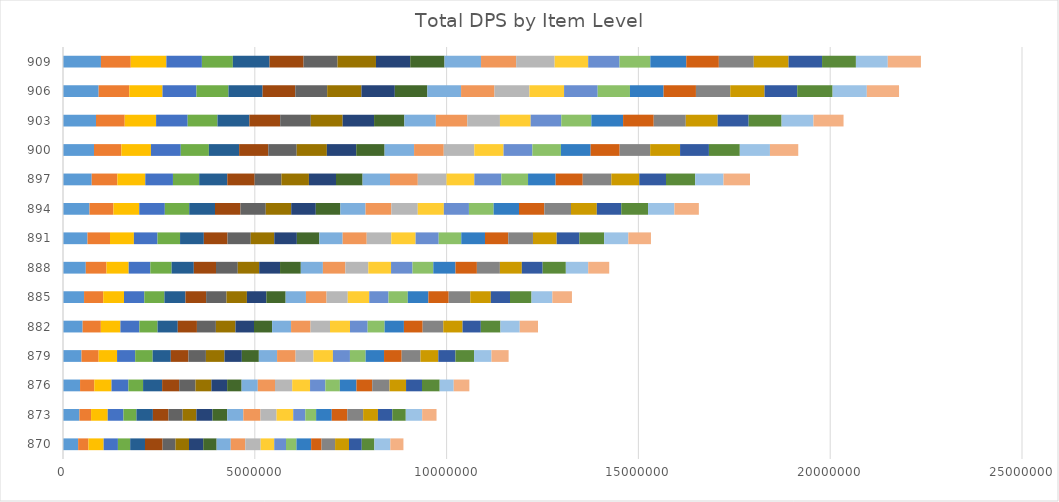
| Category | Series 0 | Series 1 | Series 2 | Series 3 | Series 4 | Series 5 | Series 6 | Series 7 | Series 8 | Series 9 | Series 10 | Series 11 | Series 12 | Series 13 | Series 14 | Series 15 | Series 16 | Series 17 | Series 18 | Series 19 | Series 20 | Series 21 | Series 22 | Series 23 | Series 24 | Series 25 |
|---|---|---|---|---|---|---|---|---|---|---|---|---|---|---|---|---|---|---|---|---|---|---|---|---|---|---|
| 870.0 | 394419.3 | 269606.9 |  | 395287.3 | 372265.7 | 319651 | 386181.6 | 458745.2 | 336645.8 | 351655.5 | 371011.5 | 349453 | 367917.1 | 379374.9 | 401429.1 | 352680 | 307700.9 | 271612.6 | 382913.7 | 271536.3 | 352859.4 | 362802.8 | 332539.2 | 328668.3 | 416358.5 | 341332.624 |
| 873.0 | 429103.8 | 302534.9 |  | 434291.1 | 409994.5 | 338336.5 | 429254.3 | 407485.4 | 368898 | 357621.7 | 420388.4 | 383134.3 | 419614.6 | 447462 | 420334.2 | 433000.1 | 315526.5 | 281643.8 | 407754.8 | 405633.5 | 412478.5 | 385521.7 | 374979.5 | 350962.3 | 427013.6 | 374518.72 |
| 876.0 | 444511.6 | 370818.8 |  | 449016.2 | 441510.3 | 381606.6 | 496777 | 444780.3 | 424818.9 | 415264.6 | 410129.5 | 376692.8 | 422042.5 | 448383.5 | 448683.9 | 465073.3 | 399655.5 | 377892.6 | 432641.5 | 410653.6 | 450718.7 | 431317.9 | 415995.7 | 460807.9 | 365951.1 | 407429.772 |
| 879.0 | 482195.6 | 447368.1 |  | 479811.2 | 472477.7 | 455389.8 | 473089.6 | 460170.7 | 455087.8 | 483439.3 | 453022.3 | 443524.2 | 475129.9 | 483216.8 | 465142.7 | 507461.1 | 443789.2 | 408812.8 | 479725.5 | 460278.4 | 489716.6 | 465396.6 | 446590.4 | 485114.9 | 453979.6 | 446797.232 |
| 882.0 | 511709.4 | 474840.4 |  | 510313.5 | 495039.3 | 472897 | 527068.3 | 499434.3 | 494561.9 | 509903.5 | 484038 | 471490.1 | 493970 | 508627.1 | 507175.1 | 520852.8 | 460364.8 | 441621.8 | 503689.7 | 488578.8 | 537109.5 | 502965 | 475935.2 | 511397.7 | 503027.1 | 476323.746 |
| 885.0 | 548711.6 | 499937.8 |  | 542245.8 | 528424.9 | 524018 | 549468.7 | 537760.2 | 530860.4 | 532608.3 | 506647.7 | 503358.8 | 529397.4 | 537203.5 | 552830.9 | 559759.7 | 502630.5 | 502392.7 | 536850.8 | 529475.7 | 562286.8 | 535909.9 | 499864.9 | 560936.8 | 543295.4 | 510705.808 |
| 888.0 | 593967.2 | 540130.5 |  | 578166.6 | 564630.7 | 554382.6 | 578956.3 | 578177.8 | 567865.5 | 557584.9 | 544213.3 | 541597.5 | 575442.3 | 586197.7 | 597583.5 | 592741.3 | 559583.1 | 542136.7 | 578510.5 | 557829.1 | 599702.5 | 571666.6 | 542790.4 | 604579.1 | 582979.1 | 547970.179 |
| 891.0 | 638242.2 | 586819 |  | 623128.4 | 616187.6 | 587162.5 | 620250.6 | 617080.6 | 605886 | 612561.4 | 589150.3 | 586010.6 | 607970.7 | 627516.2 | 639206.8 | 634757.7 | 602598.9 | 588086.3 | 618575.6 | 606650.8 | 643689.3 | 618269.2 | 591151.1 | 646307.7 | 630331.1 | 589615.483 |
| 894.0 | 691300.7 | 623134.4 |  | 673384.4 | 666714.4 | 635663.7 | 672225.1 | 664008.9 | 659563.8 | 663296.8 | 641077.1 | 640516.7 | 656329.3 | 672219 | 689261.6 | 679538.4 | 654216.3 | 643416.5 | 661264.5 | 659965.9 | 696276.1 | 672567.5 | 637530 | 698439.3 | 686125.8 | 638120.908 |
| 897.0 | 748628.3 | 668937.5 |  | 727673.9 | 721199.1 | 683577.1 | 732428 | 714039.2 | 697175.9 | 717241.8 | 705317.7 | 693514.2 | 714694.1 | 725248.9 | 747966 | 725217.1 | 704658.4 | 695609.3 | 719031.4 | 707230.2 | 745358.4 | 727654.9 | 696739.1 | 760388.5 | 739641.8 | 689593.054 |
| 900.0 | 808125.8 | 714234.9 |  | 770237.3 | 777599.1 | 732689.2 | 788670.5 | 760337.7 | 740491.3 | 785873 | 765710.9 | 739563.4 | 768428 | 773793.1 | 796297.4 | 762420.8 | 751759.2 | 744324.2 | 774770.2 | 755975.5 | 795774.1 | 779305.3 | 752104.8 | 804886.1 | 785630.3 | 738115.3 |
| 903.0 | 860784.9 | 748109.8 |  | 818228.2 | 823297.7 | 776757 | 832071 | 802683.1 | 798660 | 829695 | 818991.8 | 789811.3 | 820612.5 | 820781.5 | 850031.6 | 800689.6 | 798935.5 | 783702.6 | 826900 | 798783 | 835823.9 | 831863.4 | 806751.8 | 858362.4 | 831497 | 783988.117 |
| 906.0 | 928913.3 | 799350.4 |  | 865959.1 | 884448 | 834753.2 | 890074.5 | 851776.3 | 831738.2 | 893579.3 | 869662.7 | 848247 | 878812.2 | 871600 | 910621.4 | 902814.3 | 876551.2 | 840961.9 | 877305.9 | 842909.5 | 895071.4 | 893786.4 | 851935.7 | 921747 | 892197 | 839811.062 |
| 909.0 | 989534.9 | 776854.9 |  | 928677.2 | 925946.7 | 806801.8 | 956760.6 | 887766.7 | 884424.3 | 1001867 | 893476.7 | 893441.2 | 952227.4 | 915130.4 | 1004005.8 | 874108 | 817267 | 802907 | 937055.1 | 849193.1 | 910498.3 | 906569.4 | 873064.8 | 882785.2 | 831276.3 | 863532.704 |